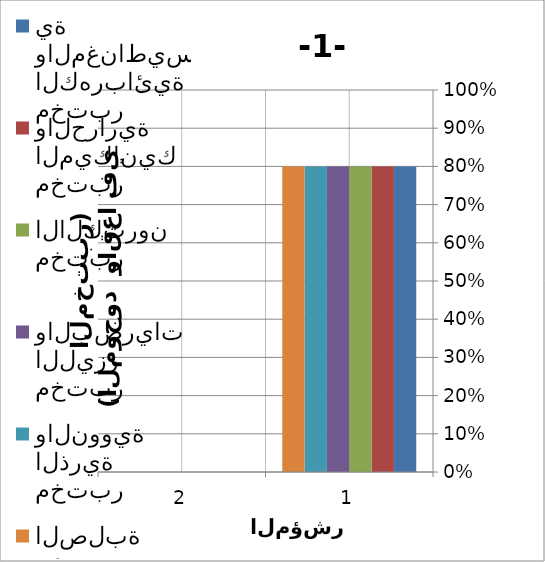
| Category | مختبر الكهربائية والمغناطيسية | مختبر الميكانيك والحرارية | مختبر الالكترون | مختبر الليزر والبصريات | مختبر الذرية والنووية | مختبر الصلبة |
|---|---|---|---|---|---|---|
| 0 | 0.8 | 0.8 | 0.8 | 0.8 | 0.8 | 0.8 |
| 1 | 0 | 0 | 0 | 0 | 0 | 0 |